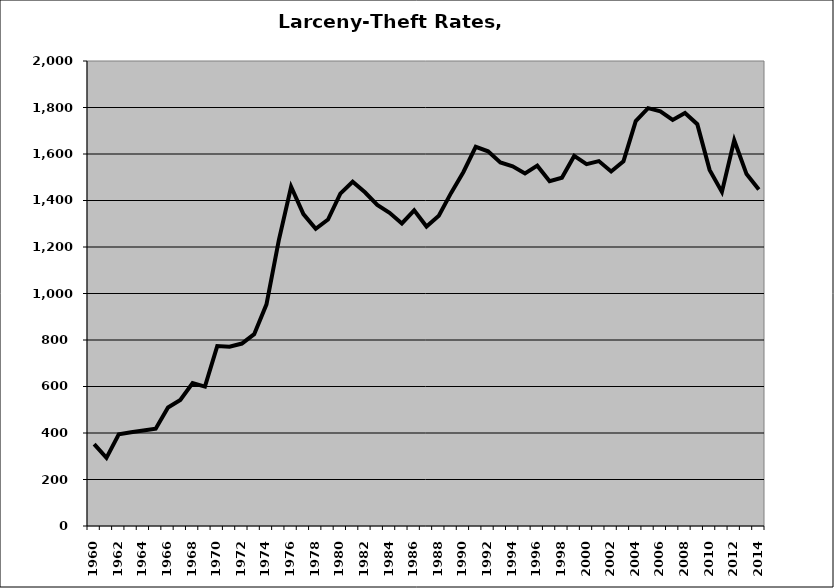
| Category | Larceny-Theft |
|---|---|
| 1960.0 | 352.501 |
| 1961.0 | 293.297 |
| 1962.0 | 394.585 |
| 1963.0 | 402.925 |
| 1964.0 | 410.406 |
| 1965.0 | 418.157 |
| 1966.0 | 509.81 |
| 1967.0 | 541.991 |
| 1968.0 | 614.737 |
| 1969.0 | 599.56 |
| 1970.0 | 773.805 |
| 1971.0 | 770.947 |
| 1972.0 | 784.728 |
| 1973.0 | 824.916 |
| 1974.0 | 953.322 |
| 1975.0 | 1228.73 |
| 1976.0 | 1458.979 |
| 1977.0 | 1341.689 |
| 1978.0 | 1278.28 |
| 1979.0 | 1318.158 |
| 1980.0 | 1429.78 |
| 1981.0 | 1480.472 |
| 1982.0 | 1435.421 |
| 1983.0 | 1380.865 |
| 1984.0 | 1347.131 |
| 1985.0 | 1301.188 |
| 1986.0 | 1357.738 |
| 1987.0 | 1288.139 |
| 1988.0 | 1334.766 |
| 1989.0 | 1432.849 |
| 1990.0 | 1522.74 |
| 1991.0 | 1630.705 |
| 1992.0 | 1611.479 |
| 1993.0 | 1563.516 |
| 1994.0 | 1547.146 |
| 1995.0 | 1516.63 |
| 1996.0 | 1549.836 |
| 1997.0 | 1483.15 |
| 1998.0 | 1497.902 |
| 1999.0 | 1591.652 |
| 2000.0 | 1556.065 |
| 2001.0 | 1569.594 |
| 2002.0 | 1524.973 |
| 2003.0 | 1568.31 |
| 2004.0 | 1741.526 |
| 2005.0 | 1797.217 |
| 2006.0 | 1783.257 |
| 2007.0 | 1746.269 |
| 2008.0 | 1776.488 |
| 2009.0 | 1728.399 |
| 2010.0 | 1531.737 |
| 2011.0 | 1437.052 |
| 2012.0 | 1658.875 |
| 2013.0 | 1513.545 |
| 2014.0 | 1447.258 |